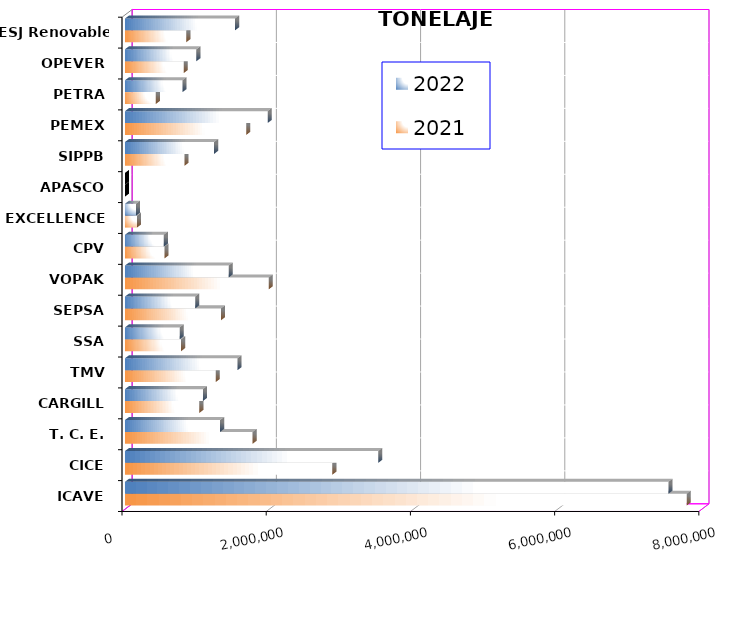
| Category | 2021 | 2022 |
|---|---|---|
| ICAVE | 7789825.735 | 7536788.807 |
| CICE | 2875662.847 | 3513170.398 |
| T. C. E. | 1770097.51 | 1319341.752 |
| CARGILL | 1031827.28 | 1080519.721 |
| TMV | 1259857.09 | 1561173.86 |
| SSA | 778774.538 | 758269.361 |
| SEPSA | 1332066.19 | 974502.96 |
| VOPAK | 1993855.654 | 1437599.503 |
| CPV | 548171.248 | 538828.34 |
| EXCELLENCE | 167145.028 | 151702.217 |
| APASCO | 0 | 0 |
| SIPPB | 826004.723 | 1236051.436 |
| PEMEX | 1682421.604 | 1978695.495 |
| PETRA | 428206.29 | 798333.42 |
| OPEVER | 814404.268 | 990182.259 |
| ESJ Renovable III | 850979.723 | 1526921.714 |